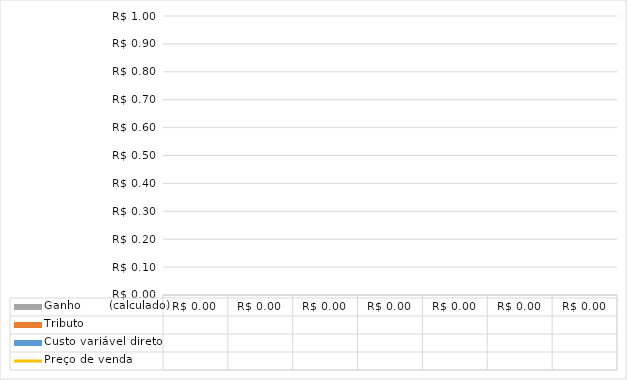
| Category | Custo variável direto | Tributo | Ganho       (calculado) |
|---|---|---|---|
|  |  |  | 0 |
|  |  |  | 0 |
|  |  |  | 0 |
|  |  |  | 0 |
|  |  |  | 0 |
|  |  |  | 0 |
|  |  |  | 0 |